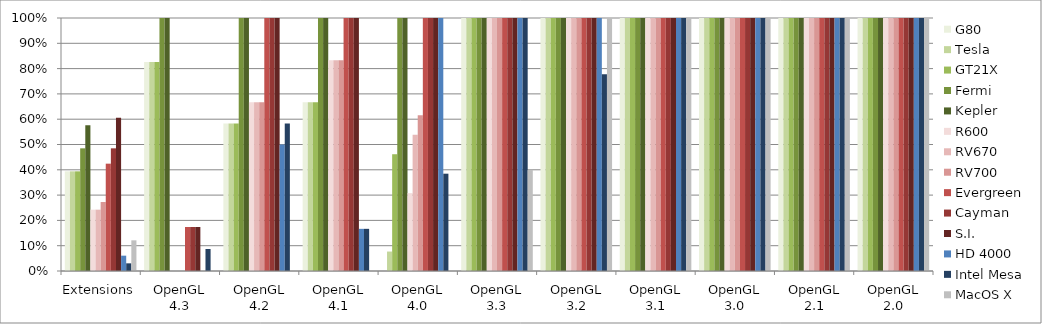
| Category | G80 | Tesla | GT21X | Fermi | Kepler | R600 | RV670 | RV700 | Evergreen | Cayman | S.I. | HD 4000 | Intel Mesa | MacOS X |
|---|---|---|---|---|---|---|---|---|---|---|---|---|---|---|
| Extensions | 0.394 | 0.394 | 0.394 | 0.485 | 0.576 | 0.242 | 0.242 | 0.273 | 0.424 | 0.485 | 0.606 | 0.061 | 0.03 | 0.121 |
| OpenGL 4.3 | 0.826 | 0.826 | 0.826 | 1 | 1 | 0 | 0 | 0 | 0.174 | 0.174 | 0.174 | 0 | 0.087 | 0 |
| OpenGL 4.2 | 0.583 | 0.583 | 0.583 | 1 | 1 | 0.667 | 0.667 | 0.667 | 1 | 1 | 1 | 0.5 | 0.583 | 0 |
| OpenGL 4.1 | 0.667 | 0.667 | 0.667 | 1 | 1 | 0.833 | 0.833 | 0.833 | 1 | 1 | 1 | 0.167 | 0.167 | 0 |
| OpenGL 4.0 | 0 | 0.077 | 0.462 | 1 | 1 | 0.308 | 0.538 | 0.615 | 1 | 1 | 1 | 1 | 0.385 | 0 |
| OpenGL 3.3 | 1 | 1 | 1 | 1 | 1 | 1 | 1 | 1 | 1 | 1 | 1 | 1 | 1 | 0.4 |
| OpenGL 3.2 | 1 | 1 | 1 | 1 | 1 | 1 | 1 | 1 | 1 | 1 | 1 | 1 | 0.778 | 1 |
| OpenGL 3.1 | 1 | 1 | 1 | 1 | 1 | 1 | 1 | 1 | 1 | 1 | 1 | 1 | 1 | 1 |
| OpenGL 3.0 | 1 | 1 | 1 | 1 | 1 | 1 | 1 | 1 | 1 | 1 | 1 | 1 | 1 | 1 |
| OpenGL 2.1 | 1 | 1 | 1 | 1 | 1 | 1 | 1 | 1 | 1 | 1 | 1 | 1 | 1 | 1 |
| OpenGL 2.0 | 1 | 1 | 1 | 1 | 1 | 1 | 1 | 1 | 1 | 1 | 1 | 1 | 1 | 1 |